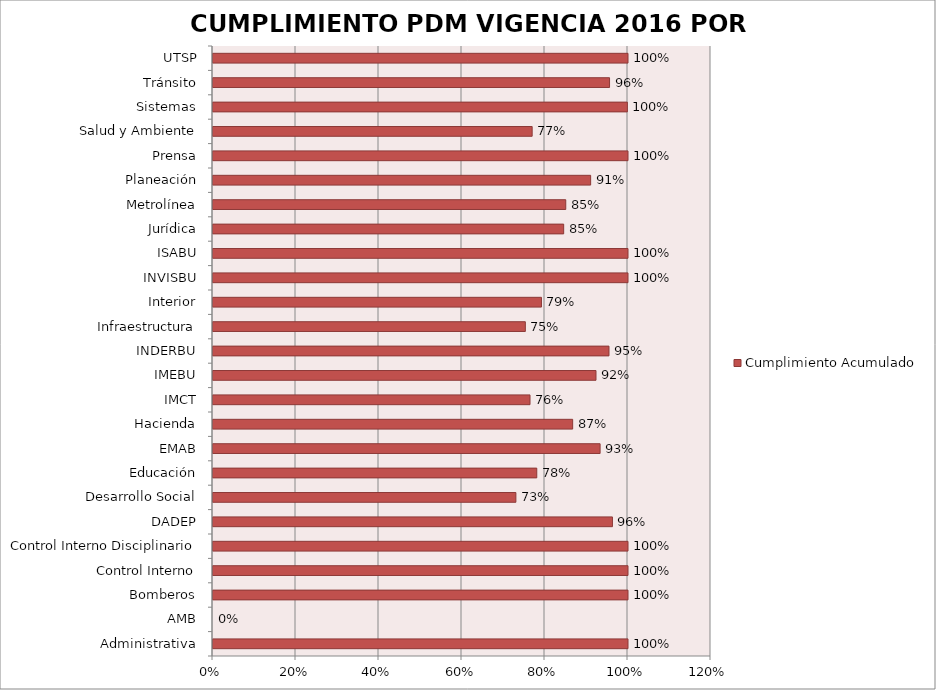
| Category | Cumplimiento Acumulado |
|---|---|
| Administrativa | 1 |
| AMB | 0 |
| Bomberos | 1 |
| Control Interno | 1 |
| Control Interno Disciplinario | 1 |
| DADEP | 0.962 |
| Desarrollo Social | 0.73 |
| Educación | 0.78 |
| EMAB | 0.933 |
| Hacienda | 0.867 |
| IMCT | 0.764 |
| IMEBU | 0.923 |
| INDERBU | 0.954 |
| Infraestructura | 0.753 |
| Interior | 0.791 |
| INVISBU | 1 |
| ISABU | 1 |
| Jurídica | 0.845 |
| Metrolínea | 0.85 |
| Planeación | 0.91 |
| Prensa | 1 |
| Salud y Ambiente | 0.769 |
| Sistemas | 0.998 |
| Tránsito | 0.956 |
| UTSP | 1 |